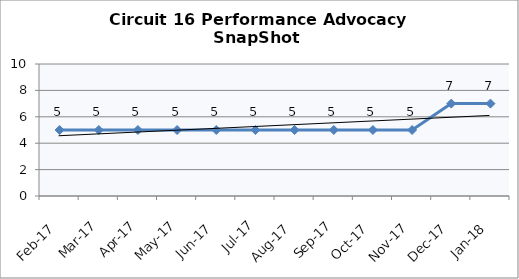
| Category | Circuit 16 |
|---|---|
| Feb-17 | 5 |
| Mar-17 | 5 |
| Apr-17 | 5 |
| May-17 | 5 |
| Jun-17 | 5 |
| Jul-17 | 5 |
| Aug-17 | 5 |
| Sep-17 | 5 |
| Oct-17 | 5 |
| Nov-17 | 5 |
| Dec-17 | 7 |
| Jan-18 | 7 |